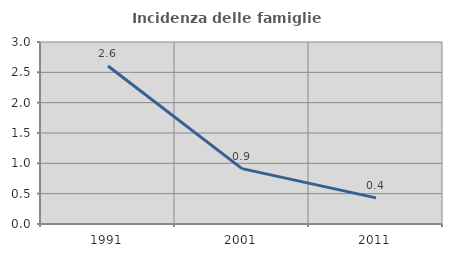
| Category | Incidenza delle famiglie numerose |
|---|---|
| 1991.0 | 2.604 |
| 2001.0 | 0.913 |
| 2011.0 | 0.431 |